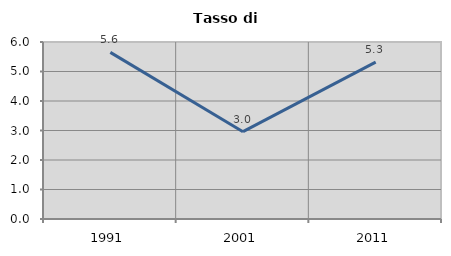
| Category | Tasso di disoccupazione   |
|---|---|
| 1991.0 | 5.647 |
| 2001.0 | 2.96 |
| 2011.0 | 5.317 |